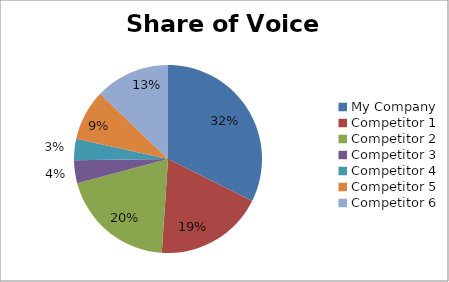
| Category | Series 0 |
|---|---|
| My Company | 0.301 |
| Competitor 1 | 0.174 |
| Competitor 2 | 0.184 |
| Competitor 3 | 0.037 |
| Competitor 4 | 0.034 |
| Competitor 5 | 0.081 |
| Competitor 6 | 0.119 |